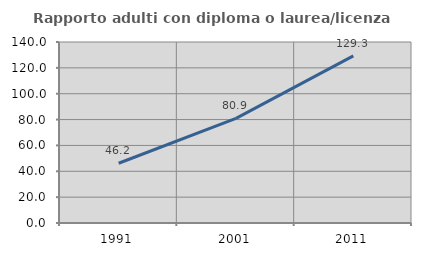
| Category | Rapporto adulti con diploma o laurea/licenza media  |
|---|---|
| 1991.0 | 46.207 |
| 2001.0 | 80.899 |
| 2011.0 | 129.291 |